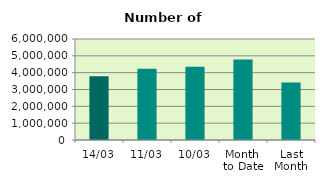
| Category | Series 0 |
|---|---|
| 14/03 | 3784668 |
| 11/03 | 4238976 |
| 10/03 | 4349292 |
| Month 
to Date | 4787072.4 |
| Last
Month | 3413232.3 |